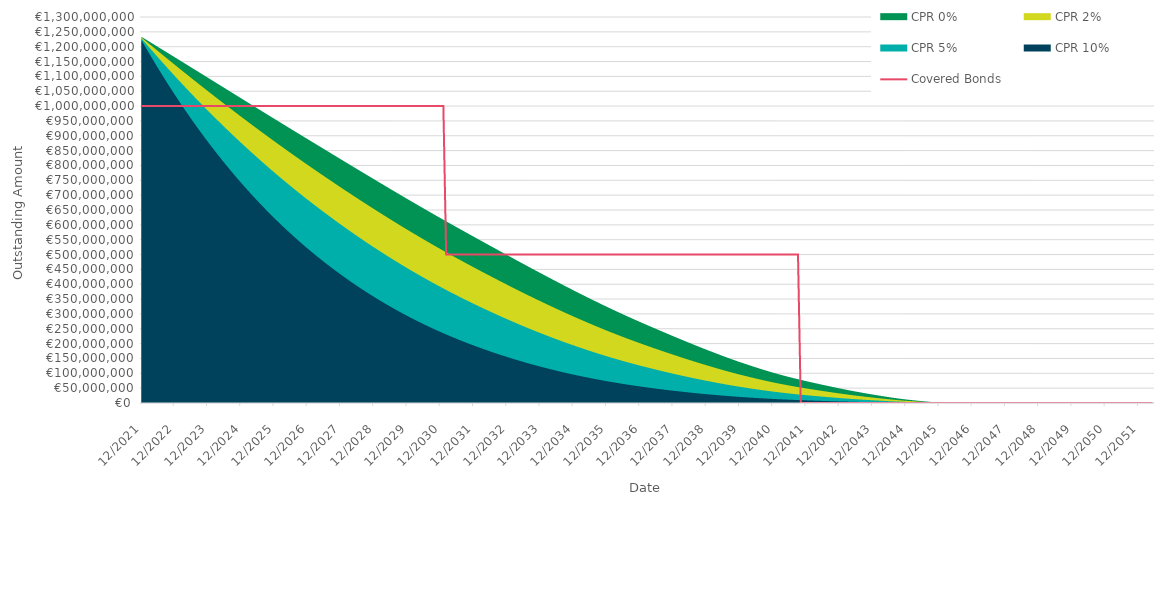
| Category | Covered Bonds |
|---|---|
| 2021-12-31 | 1000000000 |
| 2022-01-31 | 1000000000 |
| 2022-02-28 | 1000000000 |
| 2022-03-31 | 1000000000 |
| 2022-04-30 | 1000000000 |
| 2022-05-31 | 1000000000 |
| 2022-06-30 | 1000000000 |
| 2022-07-31 | 1000000000 |
| 2022-08-31 | 1000000000 |
| 2022-09-30 | 1000000000 |
| 2022-10-31 | 1000000000 |
| 2022-11-30 | 1000000000 |
| 2022-12-31 | 1000000000 |
| 2023-01-31 | 1000000000 |
| 2023-02-28 | 1000000000 |
| 2023-03-31 | 1000000000 |
| 2023-04-30 | 1000000000 |
| 2023-05-31 | 1000000000 |
| 2023-06-30 | 1000000000 |
| 2023-07-31 | 1000000000 |
| 2023-08-31 | 1000000000 |
| 2023-09-30 | 1000000000 |
| 2023-10-31 | 1000000000 |
| 2023-11-30 | 1000000000 |
| 2023-12-31 | 1000000000 |
| 2024-01-31 | 1000000000 |
| 2024-02-29 | 1000000000 |
| 2024-03-31 | 1000000000 |
| 2024-04-30 | 1000000000 |
| 2024-05-31 | 1000000000 |
| 2024-06-30 | 1000000000 |
| 2024-07-31 | 1000000000 |
| 2024-08-31 | 1000000000 |
| 2024-09-30 | 1000000000 |
| 2024-10-31 | 1000000000 |
| 2024-11-30 | 1000000000 |
| 2024-12-31 | 1000000000 |
| 2025-01-31 | 1000000000 |
| 2025-02-28 | 1000000000 |
| 2025-03-31 | 1000000000 |
| 2025-04-30 | 1000000000 |
| 2025-05-31 | 1000000000 |
| 2025-06-30 | 1000000000 |
| 2025-07-31 | 1000000000 |
| 2025-08-31 | 1000000000 |
| 2025-09-30 | 1000000000 |
| 2025-10-31 | 1000000000 |
| 2025-11-30 | 1000000000 |
| 2025-12-31 | 1000000000 |
| 2026-01-31 | 1000000000 |
| 2026-02-28 | 1000000000 |
| 2026-03-31 | 1000000000 |
| 2026-04-30 | 1000000000 |
| 2026-05-31 | 1000000000 |
| 2026-06-30 | 1000000000 |
| 2026-07-31 | 1000000000 |
| 2026-08-31 | 1000000000 |
| 2026-09-30 | 1000000000 |
| 2026-10-31 | 1000000000 |
| 2026-11-30 | 1000000000 |
| 2026-12-31 | 1000000000 |
| 2027-01-31 | 1000000000 |
| 2027-02-28 | 1000000000 |
| 2027-03-31 | 1000000000 |
| 2027-04-30 | 1000000000 |
| 2027-05-31 | 1000000000 |
| 2027-06-30 | 1000000000 |
| 2027-07-31 | 1000000000 |
| 2027-08-31 | 1000000000 |
| 2027-09-30 | 1000000000 |
| 2027-10-31 | 1000000000 |
| 2027-11-30 | 1000000000 |
| 2027-12-31 | 1000000000 |
| 2028-01-31 | 1000000000 |
| 2028-02-29 | 1000000000 |
| 2028-03-31 | 1000000000 |
| 2028-04-30 | 1000000000 |
| 2028-05-31 | 1000000000 |
| 2028-06-30 | 1000000000 |
| 2028-07-31 | 1000000000 |
| 2028-08-31 | 1000000000 |
| 2028-09-30 | 1000000000 |
| 2028-10-31 | 1000000000 |
| 2028-11-30 | 1000000000 |
| 2028-12-31 | 1000000000 |
| 2029-01-31 | 1000000000 |
| 2029-02-28 | 1000000000 |
| 2029-03-31 | 1000000000 |
| 2029-04-30 | 1000000000 |
| 2029-05-31 | 1000000000 |
| 2029-06-30 | 1000000000 |
| 2029-07-31 | 1000000000 |
| 2029-08-31 | 1000000000 |
| 2029-09-30 | 1000000000 |
| 2029-10-31 | 1000000000 |
| 2029-11-30 | 1000000000 |
| 2029-12-31 | 1000000000 |
| 2030-01-31 | 1000000000 |
| 2030-02-28 | 1000000000 |
| 2030-03-31 | 1000000000 |
| 2030-04-30 | 1000000000 |
| 2030-05-31 | 1000000000 |
| 2030-06-30 | 1000000000 |
| 2030-07-31 | 1000000000 |
| 2030-08-31 | 1000000000 |
| 2030-09-30 | 1000000000 |
| 2030-10-31 | 1000000000 |
| 2030-11-30 | 1000000000 |
| 2030-12-31 | 1000000000 |
| 2031-01-31 | 1000000000 |
| 2031-02-28 | 500000000 |
| 2031-03-31 | 500000000 |
| 2031-04-30 | 500000000 |
| 2031-05-31 | 500000000 |
| 2031-06-30 | 500000000 |
| 2031-07-31 | 500000000 |
| 2031-08-31 | 500000000 |
| 2031-09-30 | 500000000 |
| 2031-10-31 | 500000000 |
| 2031-11-30 | 500000000 |
| 2031-12-31 | 500000000 |
| 2032-01-31 | 500000000 |
| 2032-02-29 | 500000000 |
| 2032-03-31 | 500000000 |
| 2032-04-30 | 500000000 |
| 2032-05-31 | 500000000 |
| 2032-06-30 | 500000000 |
| 2032-07-31 | 500000000 |
| 2032-08-31 | 500000000 |
| 2032-09-30 | 500000000 |
| 2032-10-31 | 500000000 |
| 2032-11-30 | 500000000 |
| 2032-12-31 | 500000000 |
| 2033-01-31 | 500000000 |
| 2033-02-28 | 500000000 |
| 2033-03-31 | 500000000 |
| 2033-04-30 | 500000000 |
| 2033-05-31 | 500000000 |
| 2033-06-30 | 500000000 |
| 2033-07-31 | 500000000 |
| 2033-08-31 | 500000000 |
| 2033-09-30 | 500000000 |
| 2033-10-31 | 500000000 |
| 2033-11-30 | 500000000 |
| 2033-12-31 | 500000000 |
| 2034-01-31 | 500000000 |
| 2034-02-28 | 500000000 |
| 2034-03-31 | 500000000 |
| 2034-04-30 | 500000000 |
| 2034-05-31 | 500000000 |
| 2034-06-30 | 500000000 |
| 2034-07-31 | 500000000 |
| 2034-08-31 | 500000000 |
| 2034-09-30 | 500000000 |
| 2034-10-31 | 500000000 |
| 2034-11-30 | 500000000 |
| 2034-12-31 | 500000000 |
| 2035-01-31 | 500000000 |
| 2035-02-28 | 500000000 |
| 2035-03-31 | 500000000 |
| 2035-04-30 | 500000000 |
| 2035-05-31 | 500000000 |
| 2035-06-30 | 500000000 |
| 2035-07-31 | 500000000 |
| 2035-08-31 | 500000000 |
| 2035-09-30 | 500000000 |
| 2035-10-31 | 500000000 |
| 2035-11-30 | 500000000 |
| 2035-12-31 | 500000000 |
| 2036-01-31 | 500000000 |
| 2036-02-29 | 500000000 |
| 2036-03-31 | 500000000 |
| 2036-04-30 | 500000000 |
| 2036-05-31 | 500000000 |
| 2036-06-30 | 500000000 |
| 2036-07-31 | 500000000 |
| 2036-08-31 | 500000000 |
| 2036-09-30 | 500000000 |
| 2036-10-31 | 500000000 |
| 2036-11-30 | 500000000 |
| 2036-12-31 | 500000000 |
| 2037-01-31 | 500000000 |
| 2037-02-28 | 500000000 |
| 2037-03-31 | 500000000 |
| 2037-04-30 | 500000000 |
| 2037-05-31 | 500000000 |
| 2037-06-30 | 500000000 |
| 2037-07-31 | 500000000 |
| 2037-08-31 | 500000000 |
| 2037-09-30 | 500000000 |
| 2037-10-31 | 500000000 |
| 2037-11-30 | 500000000 |
| 2037-12-31 | 500000000 |
| 2038-01-31 | 500000000 |
| 2038-02-28 | 500000000 |
| 2038-03-31 | 500000000 |
| 2038-04-30 | 500000000 |
| 2038-05-31 | 500000000 |
| 2038-06-30 | 500000000 |
| 2038-07-31 | 500000000 |
| 2038-08-31 | 500000000 |
| 2038-09-30 | 500000000 |
| 2038-10-31 | 500000000 |
| 2038-11-30 | 500000000 |
| 2038-12-31 | 500000000 |
| 2039-01-31 | 500000000 |
| 2039-02-28 | 500000000 |
| 2039-03-31 | 500000000 |
| 2039-04-30 | 500000000 |
| 2039-05-31 | 500000000 |
| 2039-06-30 | 500000000 |
| 2039-07-31 | 500000000 |
| 2039-08-31 | 500000000 |
| 2039-09-30 | 500000000 |
| 2039-10-31 | 500000000 |
| 2039-11-30 | 500000000 |
| 2039-12-31 | 500000000 |
| 2040-01-31 | 500000000 |
| 2040-02-29 | 500000000 |
| 2040-03-31 | 500000000 |
| 2040-04-30 | 500000000 |
| 2040-05-31 | 500000000 |
| 2040-06-30 | 500000000 |
| 2040-07-31 | 500000000 |
| 2040-08-31 | 500000000 |
| 2040-09-30 | 500000000 |
| 2040-10-31 | 500000000 |
| 2040-11-30 | 500000000 |
| 2040-12-31 | 500000000 |
| 2041-01-31 | 500000000 |
| 2041-02-28 | 500000000 |
| 2041-03-31 | 500000000 |
| 2041-04-30 | 500000000 |
| 2041-05-31 | 500000000 |
| 2041-06-30 | 500000000 |
| 2041-07-31 | 500000000 |
| 2041-08-31 | 500000000 |
| 2041-09-30 | 500000000 |
| 2041-10-31 | 0 |
| 2041-11-30 | 0 |
| 2041-12-31 | 0 |
| 2042-01-31 | 0 |
| 2042-02-28 | 0 |
| 2042-03-31 | 0 |
| 2042-04-30 | 0 |
| 2042-05-31 | 0 |
| 2042-06-30 | 0 |
| 2042-07-31 | 0 |
| 2042-08-31 | 0 |
| 2042-09-30 | 0 |
| 2042-10-31 | 0 |
| 2042-11-30 | 0 |
| 2042-12-31 | 0 |
| 2043-01-31 | 0 |
| 2043-02-28 | 0 |
| 2043-03-31 | 0 |
| 2043-04-30 | 0 |
| 2043-05-31 | 0 |
| 2043-06-30 | 0 |
| 2043-07-31 | 0 |
| 2043-08-31 | 0 |
| 2043-09-30 | 0 |
| 2043-10-31 | 0 |
| 2043-11-30 | 0 |
| 2043-12-31 | 0 |
| 2044-01-31 | 0 |
| 2044-02-29 | 0 |
| 2044-03-31 | 0 |
| 2044-04-30 | 0 |
| 2044-05-31 | 0 |
| 2044-06-30 | 0 |
| 2044-07-31 | 0 |
| 2044-08-31 | 0 |
| 2044-09-30 | 0 |
| 2044-10-31 | 0 |
| 2044-11-30 | 0 |
| 2044-12-31 | 0 |
| 2045-01-31 | 0 |
| 2045-02-28 | 0 |
| 2045-03-31 | 0 |
| 2045-04-30 | 0 |
| 2045-05-31 | 0 |
| 2045-06-30 | 0 |
| 2045-07-31 | 0 |
| 2045-08-31 | 0 |
| 2045-09-30 | 0 |
| 2045-10-31 | 0 |
| 2045-11-30 | 0 |
| 2045-12-31 | 0 |
| 2046-01-31 | 0 |
| 2046-02-28 | 0 |
| 2046-03-31 | 0 |
| 2046-04-30 | 0 |
| 2046-05-31 | 0 |
| 2046-06-30 | 0 |
| 2046-07-31 | 0 |
| 2046-08-31 | 0 |
| 2046-09-30 | 0 |
| 2046-10-31 | 0 |
| 2046-11-30 | 0 |
| 2046-12-31 | 0 |
| 2047-01-31 | 0 |
| 2047-02-28 | 0 |
| 2047-03-31 | 0 |
| 2047-04-30 | 0 |
| 2047-05-31 | 0 |
| 2047-06-30 | 0 |
| 2047-07-31 | 0 |
| 2047-08-31 | 0 |
| 2047-09-30 | 0 |
| 2047-10-31 | 0 |
| 2047-11-30 | 0 |
| 2047-12-31 | 0 |
| 2048-01-31 | 0 |
| 2048-02-29 | 0 |
| 2048-03-31 | 0 |
| 2048-04-30 | 0 |
| 2048-05-31 | 0 |
| 2048-06-30 | 0 |
| 2048-07-31 | 0 |
| 2048-08-31 | 0 |
| 2048-09-30 | 0 |
| 2048-10-31 | 0 |
| 2048-11-30 | 0 |
| 2048-12-31 | 0 |
| 2049-01-31 | 0 |
| 2049-02-28 | 0 |
| 2049-03-31 | 0 |
| 2049-04-30 | 0 |
| 2049-05-31 | 0 |
| 2049-06-30 | 0 |
| 2049-07-31 | 0 |
| 2049-08-31 | 0 |
| 2049-09-30 | 0 |
| 2049-10-31 | 0 |
| 2049-11-30 | 0 |
| 2049-12-31 | 0 |
| 2050-01-31 | 0 |
| 2050-02-28 | 0 |
| 2050-03-31 | 0 |
| 2050-04-30 | 0 |
| 2050-05-31 | 0 |
| 2050-06-30 | 0 |
| 2050-07-31 | 0 |
| 2050-08-31 | 0 |
| 2050-09-30 | 0 |
| 2050-10-31 | 0 |
| 2050-11-30 | 0 |
| 2050-12-31 | 0 |
| 2051-01-31 | 0 |
| 2051-02-28 | 0 |
| 2051-03-31 | 0 |
| 2051-04-30 | 0 |
| 2051-05-31 | 0 |
| 2051-06-30 | 0 |
| 2051-07-31 | 0 |
| 2051-08-31 | 0 |
| 2051-09-30 | 0 |
| 2051-10-31 | 0 |
| 2051-11-30 | 0 |
| 2051-12-31 | 0 |
| 2052-01-31 | 0 |
| 2052-02-29 | 0 |
| 2052-03-31 | 0 |
| 2052-04-30 | 0 |
| 2052-05-31 | 0 |